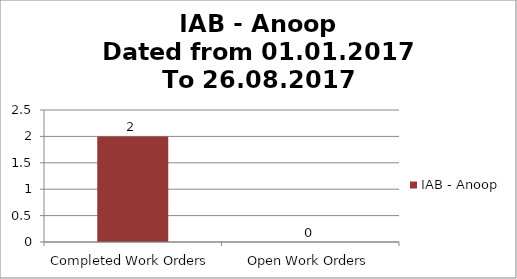
| Category | IAB - Anoop |
|---|---|
| Completed Work Orders | 2 |
| Open Work Orders | 0 |